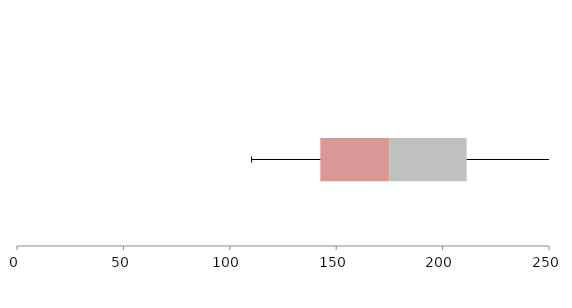
| Category | Series 1 | Series 2 | Series 3 |
|---|---|---|---|
| 0 | 142.541 | 32.463 | 36.261 |